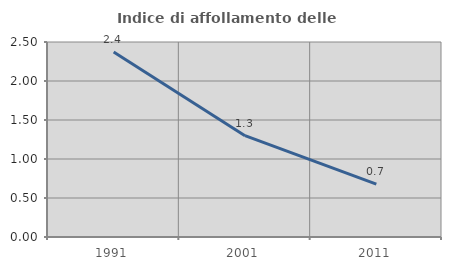
| Category | Indice di affollamento delle abitazioni  |
|---|---|
| 1991.0 | 2.371 |
| 2001.0 | 1.299 |
| 2011.0 | 0.677 |